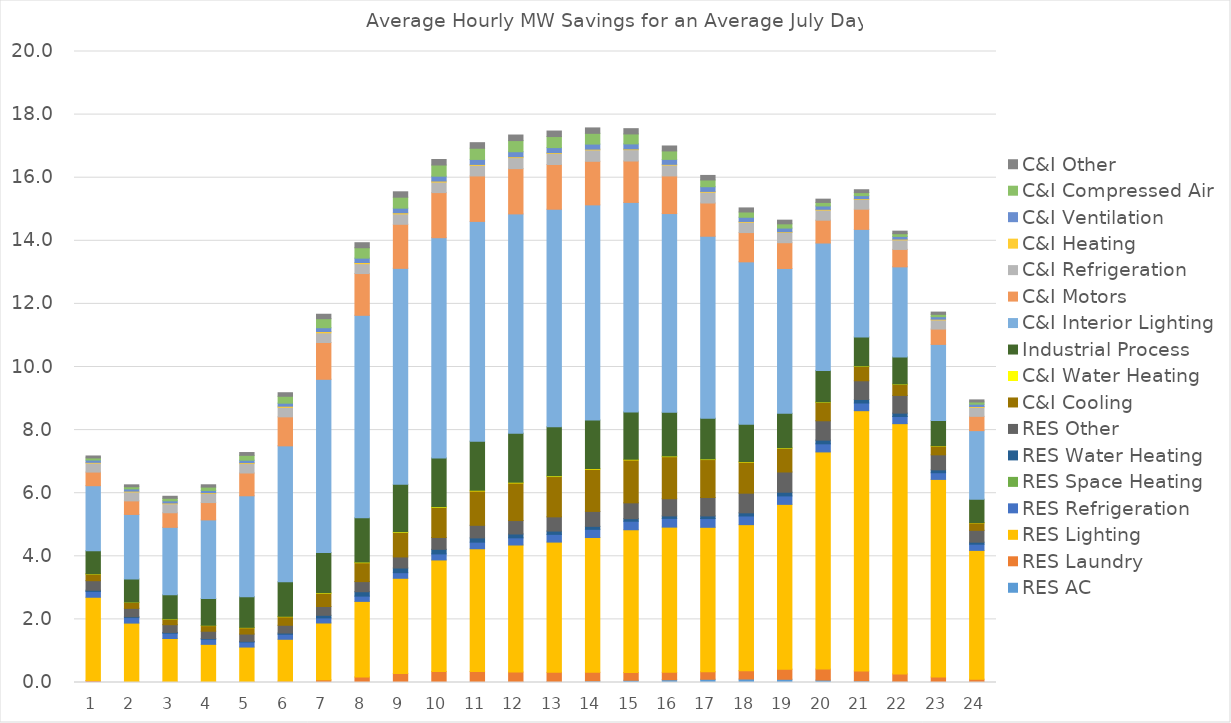
| Category | RES AC | RES Laundry | Electronics | RES Lighting | RES Refrigeration | RES Space Heating | RES Water Heating | Energy Reports | RES Other | C&I Cooling | C&I Water Heating | Industrial Process | C&I Interior Lighting | C&I Motors | C&I Refrigeration | C&I Heating | C&I Ventilation | C&I Compressed Air | Retro-Commissioning | Data Centers | C&I Other |
|---|---|---|---|---|---|---|---|---|---|---|---|---|---|---|---|---|---|---|---|---|---|
| 1.0 | 0.004 | 0.061 |  | 2.638 | 0.185 | 0 | 0.037 |  | 0.303 | 0.21 | 0.007 | 0.731 | 2.063 | 0.432 | 0.285 | 0.023 | 0.072 | 0.068 |  |  | 0.062 |
| 2.0 | 0.002 | 0.032 |  | 1.849 | 0.175 | 0 | 0.026 |  | 0.266 | 0.188 | 0.007 | 0.736 | 2.045 | 0.43 | 0.284 | 0.024 | 0.07 | 0.07 |  |  | 0.061 |
| 3.0 | 0.001 | 0.018 |  | 1.376 | 0.168 | 0 | 0.024 |  | 0.245 | 0.175 | 0.008 | 0.768 | 2.135 | 0.462 | 0.284 | 0.025 | 0.069 | 0.081 |  |  | 0.064 |
| 4.0 | 0.001 | 0.015 |  | 1.193 | 0.163 | 0 | 0.022 |  | 0.232 | 0.178 | 0.008 | 0.85 | 2.491 | 0.55 | 0.286 | 0.026 | 0.072 | 0.107 |  |  | 0.073 |
| 5.0 | 0.001 | 0.023 |  | 1.099 | 0.16 | 0 | 0.022 |  | 0.231 | 0.201 | 0.01 | 0.974 | 3.197 | 0.722 | 0.298 | 0.029 | 0.077 | 0.155 |  |  | 0.089 |
| 6.0 | 0.001 | 0.041 |  | 1.327 | 0.159 | 0 | 0.039 |  | 0.246 | 0.27 | 0.013 | 1.095 | 4.309 | 0.919 | 0.302 | 0.036 | 0.095 | 0.218 |  |  | 0.113 |
| 7.0 | 0.001 | 0.083 |  | 1.802 | 0.161 | 0 | 0.083 |  | 0.279 | 0.421 | 0.016 | 1.272 | 5.492 | 1.167 | 0.307 | 0.04 | 0.121 | 0.286 |  |  | 0.141 |
| 8.0 | 0.002 | 0.174 |  | 2.395 | 0.167 | 0 | 0.139 |  | 0.321 | 0.599 | 0.018 | 1.403 | 6.42 | 1.324 | 0.312 | 0.039 | 0.138 | 0.329 |  |  | 0.16 |
| 9.0 | 0.003 | 0.285 |  | 3.015 | 0.177 | 0 | 0.148 |  | 0.351 | 0.777 | 0.02 | 1.505 | 6.846 | 1.397 | 0.329 | 0.036 | 0.147 | 0.347 |  |  | 0.171 |
| 10.0 | 0.004 | 0.344 |  | 3.535 | 0.192 | 0 | 0.146 |  | 0.375 | 0.953 | 0.021 | 1.548 | 6.98 | 1.43 | 0.333 | 0.032 | 0.155 | 0.354 |  |  | 0.175 |
| 11.0 | 0.009 | 0.34 |  | 3.889 | 0.209 | 0 | 0.135 |  | 0.4 | 1.089 | 0.021 | 1.557 | 6.966 | 1.44 | 0.336 | 0.03 | 0.158 | 0.354 |  |  | 0.177 |
| 12.0 | 0.019 | 0.311 |  | 4.028 | 0.227 | 0 | 0.122 |  | 0.425 | 1.193 | 0.021 | 1.557 | 6.949 | 1.435 | 0.348 | 0.028 | 0.159 | 0.354 |  |  | 0.176 |
| 13.0 | 0.033 | 0.289 |  | 4.129 | 0.245 | 0 | 0.105 |  | 0.451 | 1.278 | 0.021 | 1.554 | 6.897 | 1.418 | 0.35 | 0.026 | 0.16 | 0.351 |  |  | 0.175 |
| 14.0 | 0.05 | 0.272 |  | 4.273 | 0.26 | 0 | 0.094 |  | 0.474 | 1.339 | 0.02 | 1.537 | 6.82 | 1.382 | 0.36 | 0.024 | 0.161 | 0.34 |  |  | 0.172 |
| 15.0 | 0.07 | 0.248 |  | 4.523 | 0.271 | 0 | 0.081 |  | 0.502 | 1.361 | 0.02 | 1.5 | 6.641 | 1.312 | 0.359 | 0.024 | 0.159 | 0.316 |  |  | 0.167 |
| 16.0 | 0.088 | 0.235 |  | 4.602 | 0.277 | 0 | 0.078 |  | 0.545 | 1.334 | 0.019 | 1.389 | 6.297 | 1.192 | 0.346 | 0.023 | 0.157 | 0.268 |  |  | 0.157 |
| 17.0 | 0.102 | 0.24 |  | 4.577 | 0.278 | 0 | 0.083 |  | 0.585 | 1.202 | 0.017 | 1.293 | 5.768 | 1.053 | 0.343 | 0.024 | 0.149 | 0.213 |  |  | 0.144 |
| 18.0 | 0.109 | 0.266 |  | 4.627 | 0.275 | 0 | 0.1 |  | 0.623 | 0.985 | 0.015 | 1.188 | 5.144 | 0.928 | 0.328 | 0.023 | 0.133 | 0.167 |  |  | 0.129 |
| 19.0 | 0.101 | 0.32 |  | 5.224 | 0.267 | 0 | 0.118 |  | 0.641 | 0.753 | 0.014 | 1.093 | 4.59 | 0.816 | 0.326 | 0.021 | 0.117 | 0.134 |  |  | 0.116 |
| 20.0 | 0.076 | 0.349 |  | 6.884 | 0.256 | 0 | 0.118 |  | 0.613 | 0.583 | 0.012 | 1.002 | 4.037 | 0.723 | 0.321 | 0.023 | 0.106 | 0.112 |  |  | 0.104 |
| 21.0 | 0.051 | 0.314 |  | 8.251 | 0.242 | 0 | 0.113 |  | 0.592 | 0.458 | 0.011 | 0.918 | 3.412 | 0.64 | 0.307 | 0.025 | 0.097 | 0.097 |  |  | 0.091 |
| 22.0 | 0.036 | 0.236 |  | 7.932 | 0.227 | 0 | 0.107 |  | 0.561 | 0.351 | 0.01 | 0.859 | 2.856 | 0.552 | 0.302 | 0.025 | 0.086 | 0.085 |  |  | 0.081 |
| 23.0 | 0.021 | 0.154 |  | 6.262 | 0.211 | 0 | 0.091 |  | 0.476 | 0.281 | 0.008 | 0.797 | 2.414 | 0.486 | 0.289 | 0.023 | 0.079 | 0.074 |  |  | 0.072 |
| 24.0 | 0.009 | 0.095 |  | 4.083 | 0.197 | 0 | 0.063 |  | 0.377 | 0.238 | 0.008 | 0.74 | 2.174 | 0.453 | 0.287 | 0.024 | 0.074 | 0.07 |  |  | 0.066 |